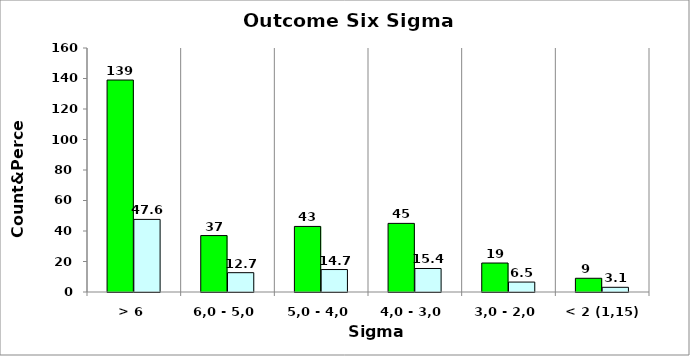
| Category | Series 0 | 47,6 12,7 14,7 15,4 6,5 3,1 |
|---|---|---|
| > 6 | 139 | 47.603 |
| 6,0 - 5,0 | 37 | 12.671 |
| 5,0 - 4,0 | 43 | 14.726 |
| 4,0 - 3,0 | 45 | 15.411 |
| 3,0 - 2,0 | 19 | 6.507 |
| < 2 (1,15) | 9 | 3.082 |